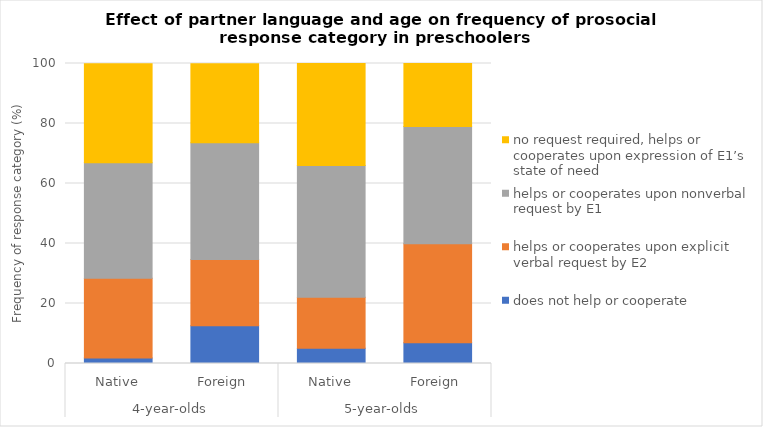
| Category | does not help or cooperate | helps or cooperates upon explicit verbal request by E2 | helps or cooperates upon nonverbal request by E1 | no request required, helps or cooperates upon expression of E1’s state of need |
|---|---|---|---|---|
| 0 | 1.8 | 26.6 | 38.5 | 33 |
| 1 | 12.6 | 22.1 | 38.9 | 26.3 |
| 2 | 5.1 | 17 | 43.9 | 34 |
| 3 | 6.9 | 33 | 39.1 | 21 |